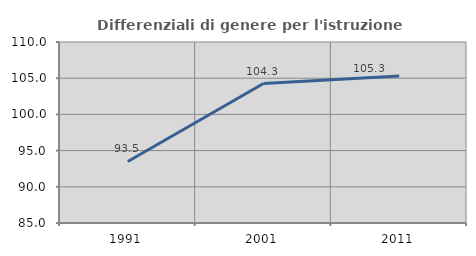
| Category | Differenziali di genere per l'istruzione superiore |
|---|---|
| 1991.0 | 93.5 |
| 2001.0 | 104.267 |
| 2011.0 | 105.308 |